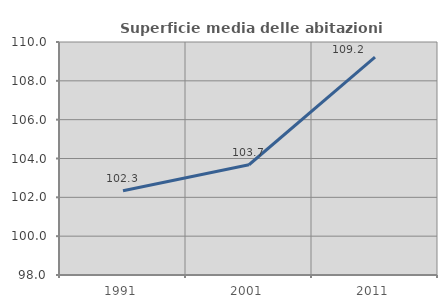
| Category | Superficie media delle abitazioni occupate |
|---|---|
| 1991.0 | 102.34 |
| 2001.0 | 103.678 |
| 2011.0 | 109.227 |